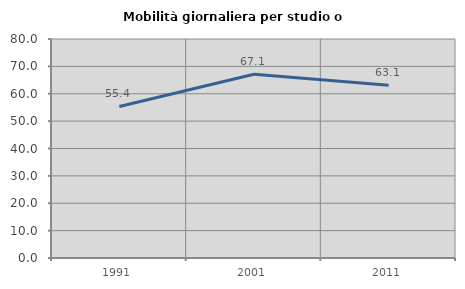
| Category | Mobilità giornaliera per studio o lavoro |
|---|---|
| 1991.0 | 55.361 |
| 2001.0 | 67.138 |
| 2011.0 | 63.116 |